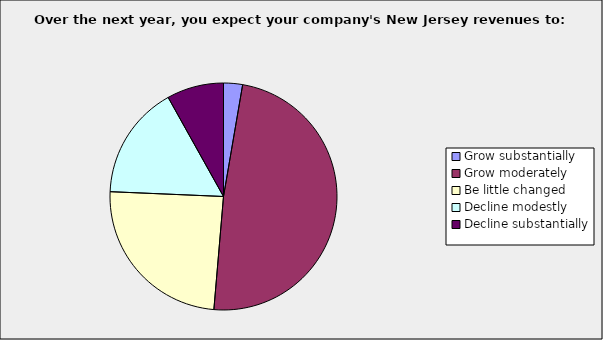
| Category | Series 0 |
|---|---|
| Grow substantially | 0.027 |
| Grow moderately | 0.486 |
| Be little changed | 0.243 |
| Decline modestly | 0.162 |
| Decline substantially | 0.081 |